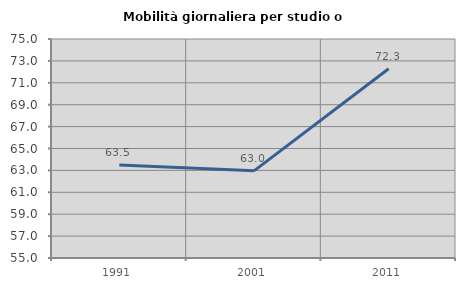
| Category | Mobilità giornaliera per studio o lavoro |
|---|---|
| 1991.0 | 63.485 |
| 2001.0 | 62.961 |
| 2011.0 | 72.285 |